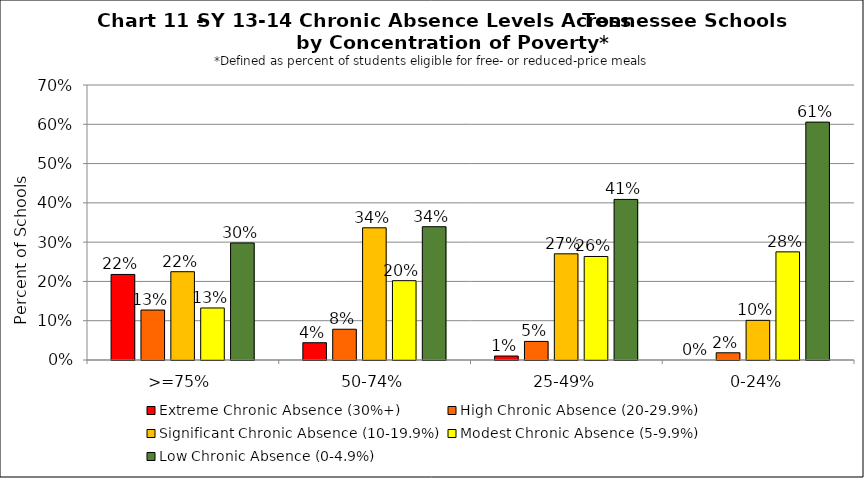
| Category | Extreme Chronic Absence (30%+) | High Chronic Absence (20-29.9%) | Significant Chronic Absence (10-19.9%) | Modest Chronic Absence (5-9.9%) | Low Chronic Absence (0-4.9%) |
|---|---|---|---|---|---|
| 0 | 0.218 | 0.127 | 0.225 | 0.132 | 0.298 |
| 1 | 0.044 | 0.078 | 0.337 | 0.202 | 0.339 |
| 2 | 0.01 | 0.047 | 0.27 | 0.264 | 0.409 |
| 3 | 0 | 0.018 | 0.101 | 0.275 | 0.606 |